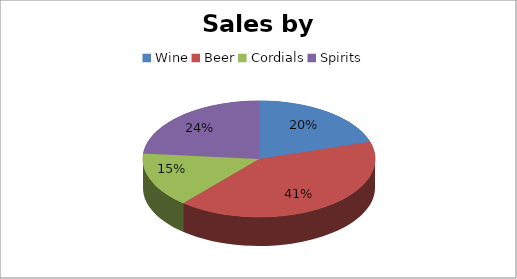
| Category | Series 0 |
|---|---|
| Wine | 4389 |
| Beer | 8912 |
| Cordials | 3299 |
| Spirits | 5107 |